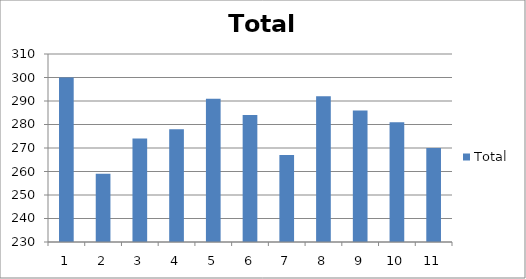
| Category | Total |
|---|---|
| 0 | 300 |
| 1 | 259 |
| 2 | 274 |
| 3 | 278 |
| 4 | 291 |
| 5 | 284 |
| 6 | 267 |
| 7 | 292 |
| 8 | 286 |
| 9 | 281 |
| 10 | 270 |